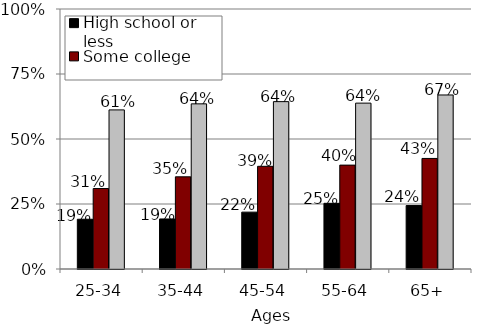
| Category | High school or less | Some college | College or more |
|---|---|---|---|
| 25-34 | 0.191 | 0.309 | 0.612 |
| 35-44 | 0.192 | 0.355 | 0.635 |
| 45-54 | 0.219 | 0.395 | 0.644 |
| 55-64 | 0.253 | 0.4 | 0.638 |
| 65+ | 0.244 | 0.425 | 0.669 |